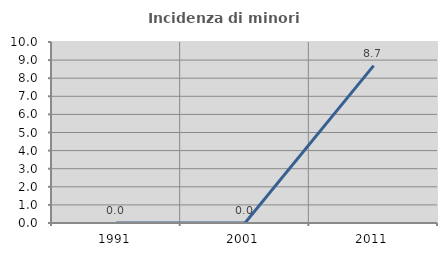
| Category | Incidenza di minori stranieri |
|---|---|
| 1991.0 | 0 |
| 2001.0 | 0 |
| 2011.0 | 8.696 |